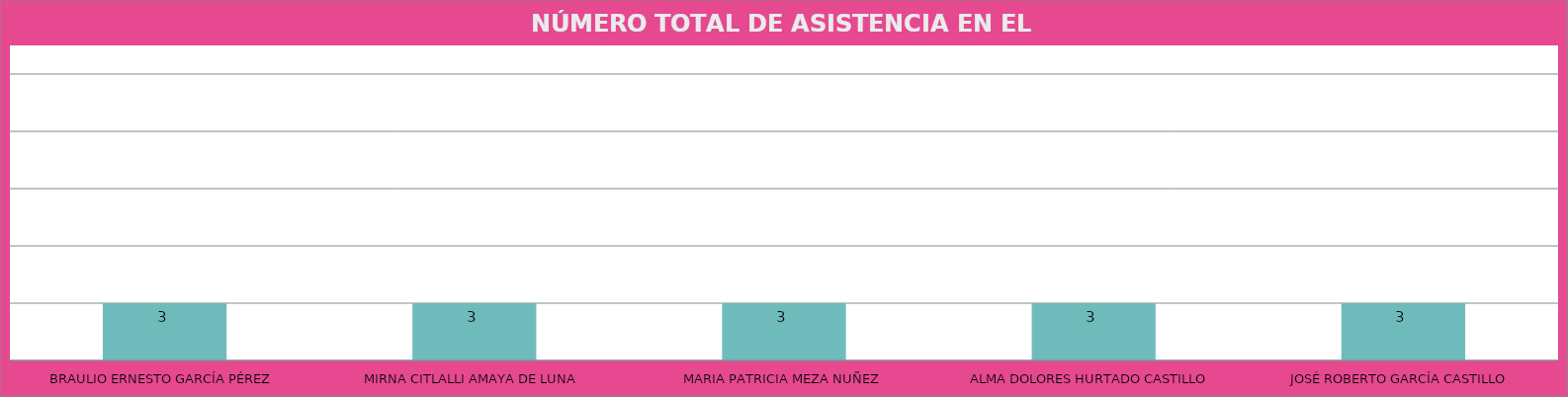
| Category | BRAULIO ERNESTO GARCÍA PÉREZ |
|---|---|
| BRAULIO ERNESTO GARCÍA PÉREZ | 3 |
| MIRNA CITLALLI AMAYA DE LUNA | 3 |
| MARIA PATRICIA MEZA NUÑEZ | 3 |
| ALMA DOLORES HURTADO CASTILLO | 3 |
| JOSÉ ROBERTO GARCÍA CASTILLO | 3 |